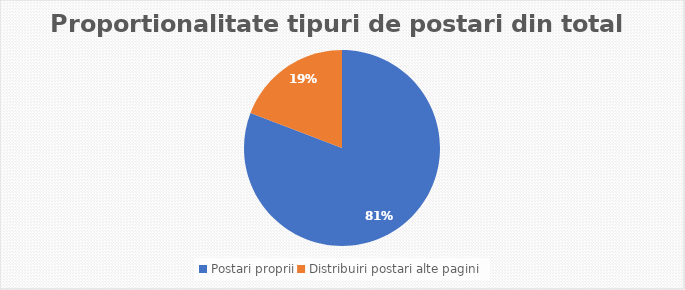
| Category | Series 0 |
|---|---|
| Postari proprii | 156 |
| Distribuiri postari alte pagini | 37 |